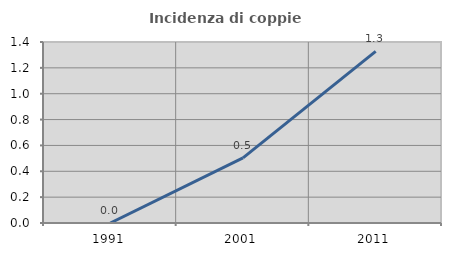
| Category | Incidenza di coppie miste |
|---|---|
| 1991.0 | 0 |
| 2001.0 | 0.504 |
| 2011.0 | 1.327 |